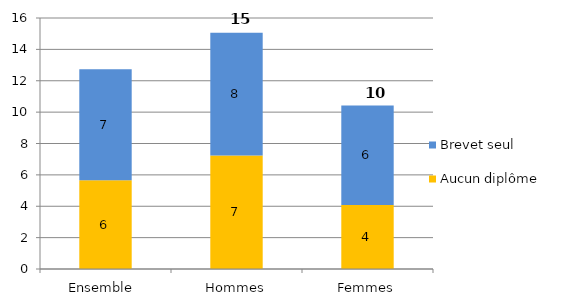
| Category | Aucun diplôme | Brevet seul |
|---|---|---|
| Ensemble  | 5.65 | 7.08 |
| Hommes | 7.24 | 7.82 |
| Femmes | 4.08 | 6.34 |